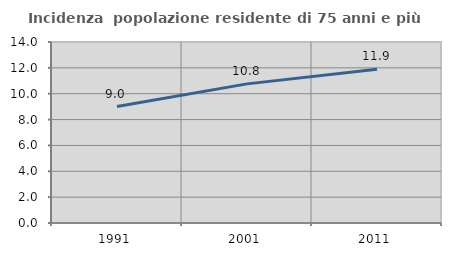
| Category | Incidenza  popolazione residente di 75 anni e più |
|---|---|
| 1991.0 | 9.008 |
| 2001.0 | 10.76 |
| 2011.0 | 11.889 |